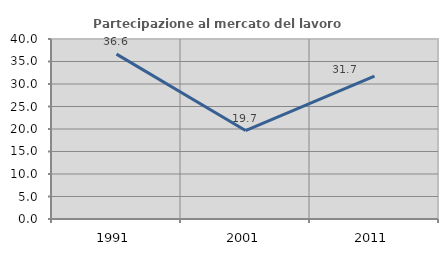
| Category | Partecipazione al mercato del lavoro  femminile |
|---|---|
| 1991.0 | 36.632 |
| 2001.0 | 19.652 |
| 2011.0 | 31.746 |